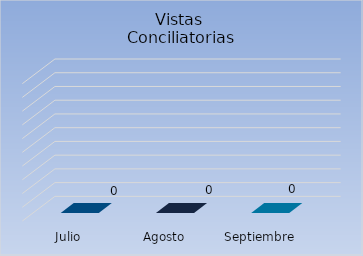
| Category | Vistas 
Conciliatorias |
|---|---|
| Julio | 0 |
| Agosto | 0 |
| Septiembre | 0 |